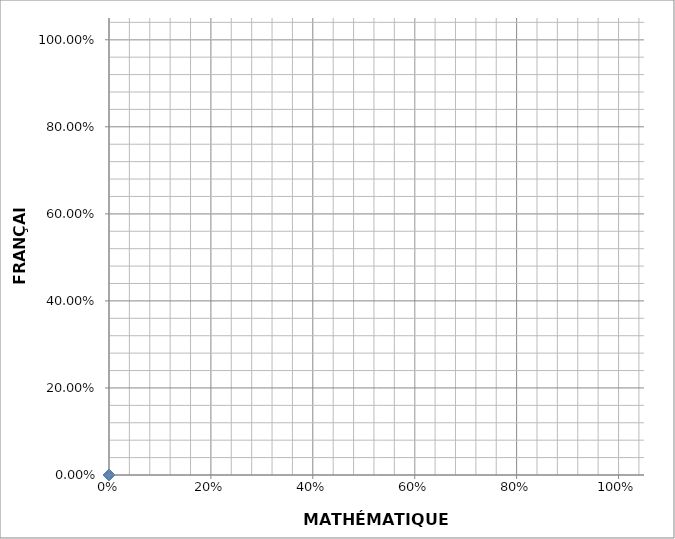
| Category | Series 0 |
|---|---|
| 0.0 | 0 |
| 0.0 | 0 |
| 0.0 | 0 |
| 0.0 | 0 |
| 0.0 | 0 |
| 0.0 | 0 |
| 0.0 | 0 |
| 0.0 | 0 |
| 0.0 | 0 |
| 0.0 | 0 |
| 0.0 | 0 |
| 0.0 | 0 |
| 0.0 | 0 |
| 0.0 | 0 |
| 0.0 | 0 |
| 0.0 | 0 |
| 0.0 | 0 |
| 0.0 | 0 |
| 0.0 | 0 |
| 0.0 | 0 |
| 0.0 | 0 |
| 0.0 | 0 |
| 0.0 | 0 |
| 0.0 | 0 |
| 0.0 | 0 |
| 0.0 | 0 |
| 0.0 | 0 |
| 0.0 | 0 |
| 0.0 | 0 |
| 0.0 | 0 |
| 0.0 | 0 |
| 0.0 | 0 |
| 0.0 | 0 |
| 0.0 | 0 |
| 0.0 | 0 |
| 0.0 | 0 |
| 0.0 | 0 |
| 0.0 | 0 |
| 0.0 | 0 |
| 0.0 | 0 |
| 0.0 | 0 |
| 0.0 | 0 |
| 0.0 | 0 |
| 0.0 | 0 |
| 0.0 | 0 |
| 0.0 | 0 |
| 0.0 | 0 |
| 0.0 | 0 |
| 0.0 | 0 |
| 0.0 | 0 |
| 0.0 | 0 |
| 0.0 | 0 |
| 0.0 | 0 |
| 0.0 | 0 |
| 0.0 | 0 |
| 0.0 | 0 |
| 0.0 | 0 |
| 0.0 | 0 |
| 0.0 | 0 |
| 0.0 | 0 |
| 0.0 | 0 |
| 0.0 | 0 |
| 0.0 | 0 |
| 0.0 | 0 |
| 0.0 | 0 |
| 0.0 | 0 |
| 0.0 | 0 |
| 0.0 | 0 |
| 0.0 | 0 |
| 0.0 | 0 |
| 0.0 | 0 |
| 0.0 | 0 |
| 0.0 | 0 |
| 0.0 | 0 |
| 0.0 | 0 |
| 0.0 | 0 |
| 0.0 | 0 |
| 0.0 | 0 |
| 0.0 | 0 |
| 0.0 | 0 |
| 0.0 | 0 |
| 0.0 | 0 |
| 0.0 | 0 |
| 0.0 | 0 |
| 0.0 | 0 |
| 0.0 | 0 |
| 0.0 | 0 |
| 0.0 | 0 |
| 0.0 | 0 |
| 0.0 | 0 |
| 0.0 | 0 |
| 0.0 | 0 |
| 0.0 | 0 |
| 0.0 | 0 |
| 0.0 | 0 |
| 0.0 | 0 |
| 0.0 | 0 |
| 0.0 | 0 |
| 0.0 | 0 |
| 0.0 | 0 |
| 0.0 | 0 |
| 0.0 | 0 |
| 0.0 | 0 |
| 0.0 | 0 |
| 0.0 | 0 |
| 0.0 | 0 |
| 0.0 | 0 |
| 0.0 | 0 |
| 0.0 | 0 |
| 0.0 | 0 |
| 0.0 | 0 |
| 0.0 | 0 |
| 0.0 | 0 |
| 0.0 | 0 |
| 0.0 | 0 |
| 0.0 | 0 |
| 0.0 | 0 |
| 0.0 | 0 |
| 0.0 | 0 |
| 0.0 | 0 |
| 0.0 | 0 |
| 0.0 | 0 |
| 0.0 | 0 |
| 0.0 | 0 |
| 0.0 | 0 |
| 0.0 | 0 |
| 0.0 | 0 |
| 0.0 | 0 |
| 0.0 | 0 |
| 0.0 | 0 |
| 0.0 | 0 |
| 0.0 | 0 |
| 0.0 | 0 |
| 0.0 | 0 |
| 0.0 | 0 |
| 0.0 | 0 |
| 0.0 | 0 |
| 0.0 | 0 |
| 0.0 | 0 |
| 0.0 | 0 |
| 0.0 | 0 |
| 0.0 | 0 |
| 0.0 | 0 |
| 0.0 | 0 |
| 0.0 | 0 |
| 0.0 | 0 |
| 0.0 | 0 |
| 0.0 | 0 |
| 0.0 | 0 |
| 0.0 | 0 |
| 0.0 | 0 |
| 0.0 | 0 |
| 0.0 | 0 |
| 0.0 | 0 |
| 0.0 | 0 |
| 0.0 | 0 |
| 0.0 | 0 |
| 0.0 | 0 |
| 0.0 | 0 |
| 0.0 | 0 |
| 0.0 | 0 |
| 0.0 | 0 |
| 0.0 | 0 |
| 0.0 | 0 |
| 0.0 | 0 |
| 0.0 | 0 |
| 0.0 | 0 |
| 0.0 | 0 |
| 0.0 | 0 |
| 0.0 | 0 |
| 0.0 | 0 |
| 0.0 | 0 |
| 0.0 | 0 |
| 0.0 | 0 |
| 0.0 | 0 |
| 0.0 | 0 |
| 0.0 | 0 |
| 0.0 | 0 |
| 0.0 | 0 |
| 0.0 | 0 |
| 0.0 | 0 |
| 0.0 | 0 |
| 0.0 | 0 |
| 0.0 | 0 |
| 0.0 | 0 |
| 0.0 | 0 |
| 0.0 | 0 |
| 0.0 | 0 |
| 0.0 | 0 |
| 0.0 | 0 |
| 0.0 | 0 |
| 0.0 | 0 |
| 0.0 | 0 |
| 0.0 | 0 |
| 0.0 | 0 |
| 0.0 | 0 |
| 0.0 | 0 |
| 0.0 | 0 |
| 0.0 | 0 |
| 0.0 | 0 |
| 0.0 | 0 |
| 0.0 | 0 |
| 0.0 | 0 |
| 0.0 | 0 |
| 0.0 | 0 |
| 0.0 | 0 |
| 0.0 | 0 |
| 0.0 | 0 |
| 0.0 | 0 |
| 0.0 | 0 |
| 0.0 | 0 |
| 0.0 | 0 |
| 0.0 | 0 |
| 0.0 | 0 |
| 0.0 | 0 |
| 0.0 | 0 |
| 0.0 | 0 |
| 0.0 | 0 |
| 0.0 | 0 |
| 0.0 | 0 |
| 0.0 | 0 |
| 0.0 | 0 |
| 0.0 | 0 |
| 0.0 | 0 |
| 0.0 | 0 |
| 0.0 | 0 |
| 0.0 | 0 |
| 0.0 | 0 |
| 0.0 | 0 |
| 0.0 | 0 |
| 0.0 | 0 |
| 0.0 | 0 |
| 0.0 | 0 |
| 0.0 | 0 |
| 0.0 | 0 |
| 0.0 | 0 |
| 0.0 | 0 |
| 0.0 | 0 |
| 0.0 | 0 |
| 0.0 | 0 |
| 0.0 | 0 |
| 0.0 | 0 |
| 0.0 | 0 |
| 0.0 | 0 |
| 0.0 | 0 |
| 0.0 | 0 |
| 0.0 | 0 |
| 0.0 | 0 |
| 0.0 | 0 |
| 0.0 | 0 |
| 0.0 | 0 |
| 0.0 | 0 |
| 0.0 | 0 |
| 0.0 | 0 |
| 0.0 | 0 |
| 0.0 | 0 |
| 0.0 | 0 |
| 0.0 | 0 |
| 0.0 | 0 |
| 0.0 | 0 |
| 0.0 | 0 |
| 0.0 | 0 |
| 0.0 | 0 |
| 0.0 | 0 |
| 0.0 | 0 |
| 0.0 | 0 |
| 0.0 | 0 |
| 0.0 | 0 |
| 0.0 | 0 |
| 0.0 | 0 |
| 0.0 | 0 |
| 0.0 | 0 |
| 0.0 | 0 |
| 0.0 | 0 |
| 0.0 | 0 |
| 0.0 | 0 |
| 0.0 | 0 |
| 0.0 | 0 |
| 0.0 | 0 |
| 0.0 | 0 |
| 0.0 | 0 |
| 0.0 | 0 |
| 0.0 | 0 |
| 0.0 | 0 |
| 0.0 | 0 |
| 0.0 | 0 |
| 0.0 | 0 |
| 0.0 | 0 |
| 0.0 | 0 |
| 0.0 | 0 |
| 0.0 | 0 |
| 0.0 | 0 |
| 0.0 | 0 |
| 0.0 | 0 |
| 0.0 | 0 |
| 0.0 | 0 |
| 0.0 | 0 |
| 0.0 | 0 |
| 0.0 | 0 |
| 0.0 | 0 |
| 0.0 | 0 |
| 0.0 | 0 |
| 0.0 | 0 |
| 0.0 | 0 |
| 0.0 | 0 |
| 0.0 | 0 |
| 0.0 | 0 |
| 0.0 | 0 |
| 0.0 | 0 |
| 0.0 | 0 |
| 0.0 | 0 |
| 0.0 | 0 |
| 0.0 | 0 |
| 0.0 | 0 |
| 0.0 | 0 |
| 0.0 | 0 |
| 0.0 | 0 |
| 0.0 | 0 |
| 0.0 | 0 |
| 0.0 | 0 |
| 0.0 | 0 |
| 0.0 | 0 |
| 0.0 | 0 |
| 0.0 | 0 |
| 0.0 | 0 |
| 0.0 | 0 |
| 0.0 | 0 |
| 0.0 | 0 |
| 0.0 | 0 |
| 0.0 | 0 |
| 0.0 | 0 |
| 0.0 | 0 |
| 0.0 | 0 |
| 0.0 | 0 |
| 0.0 | 0 |
| 0.0 | 0 |
| 0.0 | 0 |
| 0.0 | 0 |
| 0.0 | 0 |
| 0.0 | 0 |
| 0.0 | 0 |
| 0.0 | 0 |
| 0.0 | 0 |
| 0.0 | 0 |
| 0.0 | 0 |
| 0.0 | 0 |
| 0.0 | 0 |
| 0.0 | 0 |
| 0.0 | 0 |
| 0.0 | 0 |